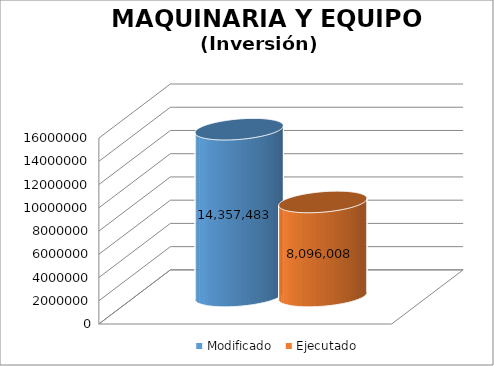
| Category | Modificado | Ejecutado |
|---|---|---|
| 0 | 14357483 | 8096007.88 |